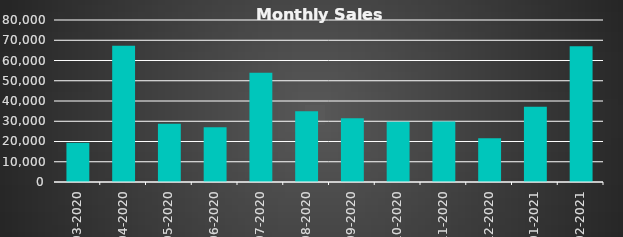
| Category |  Sales  |
|---|---|
| 2020-03-31 | 19350 |
| 2020-04-30 | 67338 |
| 2020-05-31 | 28720 |
| 2020-06-30 | 27020 |
| 2020-07-31 | 54000 |
| 2020-08-31 | 35000 |
| 2020-09-30 | 31500 |
| 2020-10-31 | 29780 |
| 2020-11-30 | 29900 |
| 2020-12-31 | 21658 |
| 2021-01-31 | 37200 |
| 2021-02-28 | 67057 |